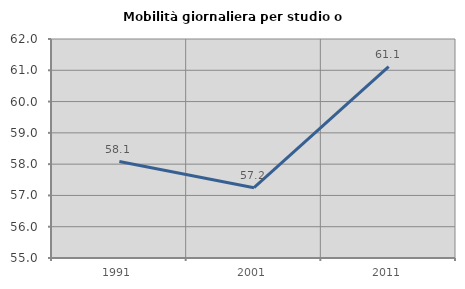
| Category | Mobilità giornaliera per studio o lavoro |
|---|---|
| 1991.0 | 58.083 |
| 2001.0 | 57.248 |
| 2011.0 | 61.114 |